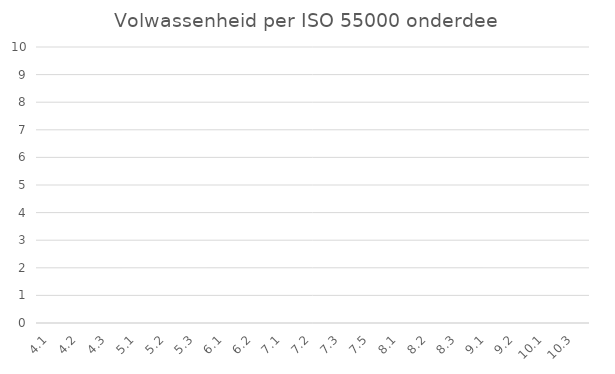
| Category | Series 0 |
|---|---|
| 4.1 | 0 |
| 4.2 | 0 |
| 4.3 | 0 |
| 5.1 | 0 |
| 5.2 | 0 |
| 5.3 | 0 |
| 6.1 | 0 |
| 6.2 | 0 |
| 7.1 | 0 |
| 7.2 | 0 |
| 7.3 | 0 |
| 7.5 | 0 |
| 8.1 | 0 |
| 8.2 | 0 |
| 8.3 | 0 |
| 9.1 | 0 |
| 9.2 | 0 |
| 10.1 | 0 |
| 10.3 | 0 |